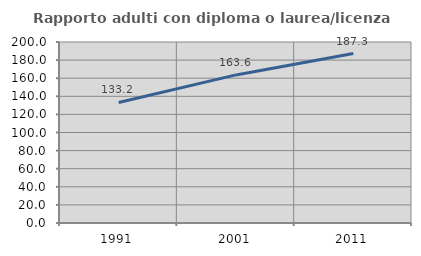
| Category | Rapporto adulti con diploma o laurea/licenza media  |
|---|---|
| 1991.0 | 133.198 |
| 2001.0 | 163.632 |
| 2011.0 | 187.288 |